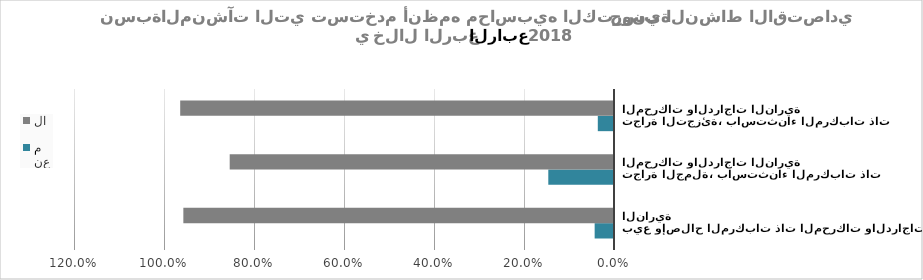
| Category | نعم | لا |
|---|---|---|
| بيع وإصلاح المركبات ذات المحركات والدراجات النارية | 0.043 | 0.957 |
| تجارة الجملة، باستثناء المركبات ذات المحركات والدراجات النارية | 0.146 | 0.854 |
| تجارة التجزئة، باستثناء المركبات ذات المحركات والدراجات النارية | 0.036 | 0.964 |